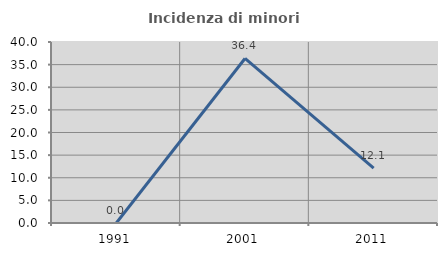
| Category | Incidenza di minori stranieri |
|---|---|
| 1991.0 | 0 |
| 2001.0 | 36.364 |
| 2011.0 | 12.121 |